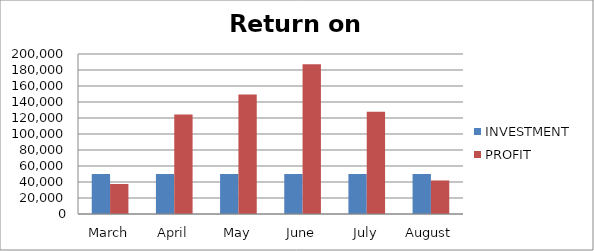
| Category | INVESTMENT  | PROFIT |
|---|---|---|
| March | 50000 | 37500 |
| April | 50000 | 124447 |
| May | 50000 | 149286 |
| June | 50000 | 187101 |
| July | 50000 | 127679 |
| August | 50000 | 41919 |